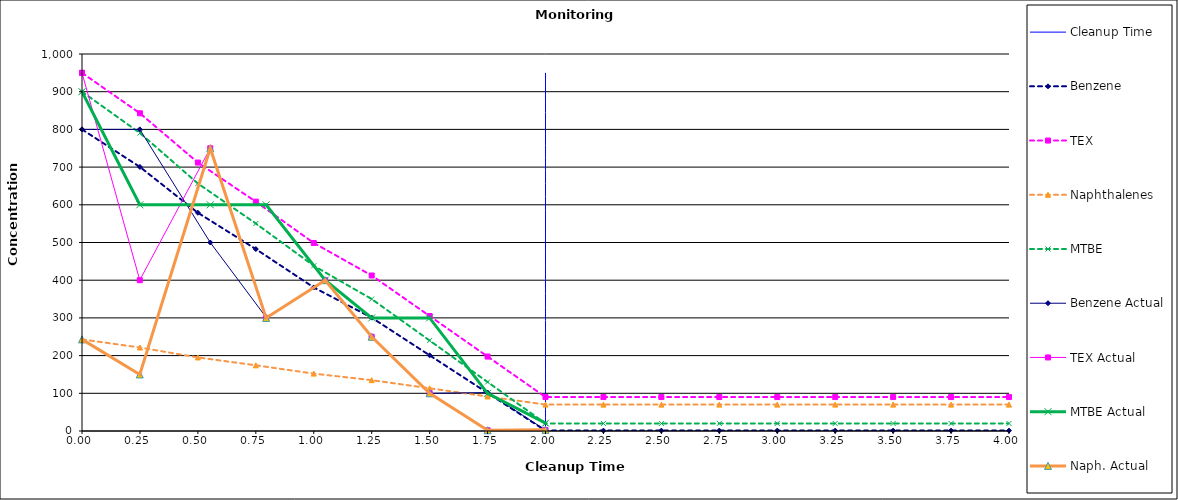
| Category | Cleanup Time |
|---|---|
| 2.0 | 0 |
| 2.0 | 950 |